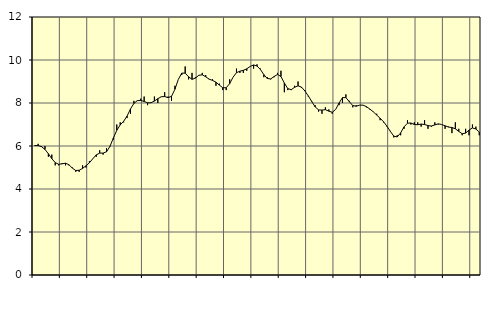
| Category | Piggar | Series 1 |
|---|---|---|
| nan | 6 | 6.02 |
| 87.0 | 6.1 | 6.02 |
| 87.0 | 6 | 5.97 |
| 87.0 | 6 | 5.84 |
| nan | 5.5 | 5.64 |
| 88.0 | 5.6 | 5.41 |
| 88.0 | 5.1 | 5.23 |
| 88.0 | 5.1 | 5.15 |
| nan | 5.2 | 5.17 |
| 89.0 | 5.1 | 5.2 |
| 89.0 | 5.1 | 5.13 |
| 89.0 | 5 | 4.97 |
| nan | 4.8 | 4.86 |
| 90.0 | 4.8 | 4.87 |
| 90.0 | 5.1 | 4.96 |
| 90.0 | 5 | 5.08 |
| nan | 5.3 | 5.22 |
| 91.0 | 5.4 | 5.41 |
| 91.0 | 5.5 | 5.59 |
| 91.0 | 5.8 | 5.67 |
| nan | 5.6 | 5.67 |
| 92.0 | 5.9 | 5.73 |
| 92.0 | 6 | 5.98 |
| 92.0 | 6.3 | 6.37 |
| nan | 7 | 6.73 |
| 93.0 | 7.1 | 6.98 |
| 93.0 | 7.1 | 7.15 |
| 93.0 | 7.3 | 7.39 |
| nan | 7.5 | 7.72 |
| 94.0 | 8.1 | 7.98 |
| 94.0 | 8.1 | 8.11 |
| 94.0 | 8.2 | 8.12 |
| nan | 8.3 | 8.07 |
| 95.0 | 7.9 | 8.01 |
| 95.0 | 8 | 8.01 |
| 95.0 | 8.3 | 8.09 |
| nan | 8 | 8.2 |
| 96.0 | 8.3 | 8.29 |
| 96.0 | 8.5 | 8.3 |
| 96.0 | 8.3 | 8.25 |
| nan | 8.1 | 8.31 |
| 97.0 | 8.8 | 8.64 |
| 97.0 | 9.1 | 9.1 |
| 97.0 | 9.3 | 9.39 |
| nan | 9.7 | 9.39 |
| 98.0 | 9.1 | 9.22 |
| 98.0 | 9.4 | 9.1 |
| 98.0 | 9.2 | 9.16 |
| nan | 9.3 | 9.29 |
| 99.0 | 9.4 | 9.31 |
| 99.0 | 9.3 | 9.22 |
| 99.0 | 9.1 | 9.11 |
| nan | 9.1 | 9.05 |
| 0.0 | 8.8 | 8.97 |
| 0.0 | 8.9 | 8.83 |
| 0.0 | 8.6 | 8.71 |
| nan | 8.6 | 8.71 |
| 1.0 | 9.1 | 8.9 |
| 1.0 | 9.2 | 9.2 |
| 1.0 | 9.6 | 9.41 |
| nan | 9.4 | 9.48 |
| 2.0 | 9.4 | 9.52 |
| 2.0 | 9.5 | 9.59 |
| 2.0 | 9.7 | 9.7 |
| nan | 9.6 | 9.77 |
| 3.0 | 9.8 | 9.72 |
| 3.0 | 9.6 | 9.56 |
| 3.0 | 9.2 | 9.32 |
| nan | 9.2 | 9.14 |
| 4.0 | 9.1 | 9.12 |
| 4.0 | 9.2 | 9.23 |
| 4.0 | 9.4 | 9.33 |
| nan | 9.5 | 9.23 |
| 5.0 | 8.5 | 8.93 |
| 5.0 | 8.6 | 8.67 |
| 5.0 | 8.6 | 8.62 |
| nan | 8.8 | 8.73 |
| 6.0 | 9 | 8.8 |
| 6.0 | 8.7 | 8.74 |
| 6.0 | 8.6 | 8.56 |
| nan | 8.3 | 8.33 |
| 7.0 | 8.1 | 8.07 |
| 7.0 | 7.9 | 7.82 |
| 7.0 | 7.6 | 7.68 |
| nan | 7.5 | 7.67 |
| 8.0 | 7.8 | 7.69 |
| 8.0 | 7.7 | 7.62 |
| 8.0 | 7.5 | 7.57 |
| nan | 7.7 | 7.7 |
| 9.0 | 7.9 | 8 |
| 9.0 | 8 | 8.25 |
| 9.0 | 8.4 | 8.25 |
| nan | 8.1 | 8.06 |
| 10.0 | 7.8 | 7.88 |
| 10.0 | 7.9 | 7.85 |
| 10.0 | 7.9 | 7.9 |
| nan | 7.9 | 7.9 |
| 11.0 | 7.8 | 7.83 |
| 11.0 | 7.7 | 7.72 |
| 11.0 | 7.6 | 7.59 |
| nan | 7.5 | 7.44 |
| 12.0 | 7.2 | 7.29 |
| 12.0 | 7.1 | 7.13 |
| 12.0 | 6.9 | 6.92 |
| nan | 6.7 | 6.68 |
| 13.0 | 6.4 | 6.46 |
| 13.0 | 6.5 | 6.42 |
| 13.0 | 6.5 | 6.61 |
| nan | 6.8 | 6.89 |
| 14.0 | 7.2 | 7.06 |
| 14.0 | 7 | 7.07 |
| 14.0 | 7.1 | 7 |
| nan | 7.1 | 6.99 |
| 15.0 | 6.9 | 7.02 |
| 15.0 | 7.2 | 7 |
| 15.0 | 6.8 | 6.95 |
| nan | 6.9 | 6.93 |
| 16.0 | 7.1 | 6.98 |
| 16.0 | 7 | 7.03 |
| 16.0 | 7 | 7 |
| nan | 6.8 | 6.94 |
| 17.0 | 6.9 | 6.88 |
| 17.0 | 6.6 | 6.86 |
| 17.0 | 7.1 | 6.8 |
| nan | 6.8 | 6.68 |
| 18.0 | 6.5 | 6.57 |
| 18.0 | 6.8 | 6.6 |
| 18.0 | 6.5 | 6.74 |
| nan | 7 | 6.84 |
| 19.0 | 6.9 | 6.79 |
| 19.0 | 6.5 | 6.65 |